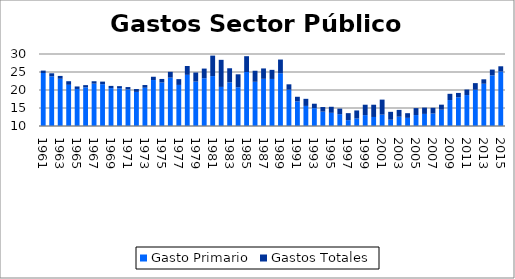
| Category | Gasto Primario | Gastos Totales |
|---|---|---|
| 1961.0 | 24.72 | 0.67 |
| 1962.0 | 23.79 | 0.85 |
| 1963.0 | 23.12 | 0.79 |
| 1964.0 | 21.44 | 1 |
| 1965.0 | 20.29 | 0.69 |
| 1966.0 | 20.7 | 0.65 |
| 1967.0 | 21.76 | 0.67 |
| 1968.0 | 21.61 | 0.72 |
| 1969.0 | 20.53 | 0.61 |
| 1970.0 | 20.48 | 0.59 |
| 1971.0 | 20.16 | 0.66 |
| 1972.0 | 19.47 | 0.8 |
| 1973.0 | 20.62 | 0.76 |
| 1974.0 | 22.77 | 0.91 |
| 1975.0 | 22.09 | 0.98 |
| 1976.0 | 23.44 | 1.61 |
| 1977.0 | 21.41 | 1.61 |
| 1978.0 | 24.21 | 2.45 |
| 1979.0 | 22.34 | 2.52 |
| 1980.0 | 23.27 | 2.68 |
| 1981.0 | 23.86 | 5.69 |
| 1982.0 | 20.86 | 7.52 |
| 1983.0 | 22.11 | 3.93 |
| 1984.0 | 20.77 | 3.59 |
| 1985.0 | 25 | 4.39 |
| 1986.0 | 22.28 | 3.07 |
| 1987.0 | 23.11 | 2.88 |
| 1988.0 | 23.07 | 2.53 |
| 1989.0 | 24.66 | 3.8 |
| 1990.0 | 20.07 | 1.51 |
| 1991.0 | 16.83 | 1.29 |
| 1992.0 | 15.58 | 1.97 |
| 1993.0 | 14.96 | 1.23 |
| 1994.0 | 13.99 | 1.28 |
| 1995.0 | 13.66 | 1.68 |
| 1996.0 | 13.28 | 1.55 |
| 1997.0 | 11.62 | 1.95 |
| 1998.0 | 12.08 | 2.24 |
| 1999.0 | 13.02 | 2.89 |
| 2000.0 | 12.51 | 3.4 |
| 2001.0 | 13.16 | 4.17 |
| 2002.0 | 11.76 | 2.18 |
| 2003.0 | 12.58 | 1.89 |
| 2004.0 | 12.26 | 1.3 |
| 2005.0 | 13.04 | 1.93 |
| 2006.0 | 13.36 | 1.75 |
| 2007.0 | 13.467 | 1.599 |
| 2008.0 | 14.534 | 1.392 |
| 2009.0 | 17.21 | 1.73 |
| 2010.0 | 17.968 | 1.218 |
| 2011.0 | 18.595 | 1.539 |
| 2012.0 | 20.06 | 1.851 |
| 2013.0 | 21.736 | 1.233 |
| 2014.0 | 24.064 | 1.613 |
| 2015.0 | 25.132 | 1.457 |